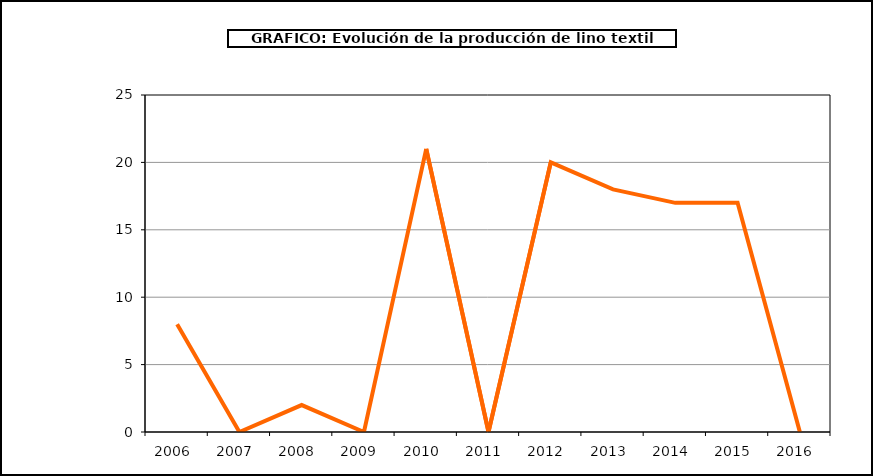
| Category | producción |
|---|---|
| 2006.0 | 8 |
| 2007.0 | 0 |
| 2008.0 | 2 |
| 2009.0 | 0 |
| 2010.0 | 21 |
| 2011.0 | 0 |
| 2012.0 | 20 |
| 2013.0 | 18 |
| 2014.0 | 17 |
| 2015.0 | 17 |
| 2016.0 | 0 |